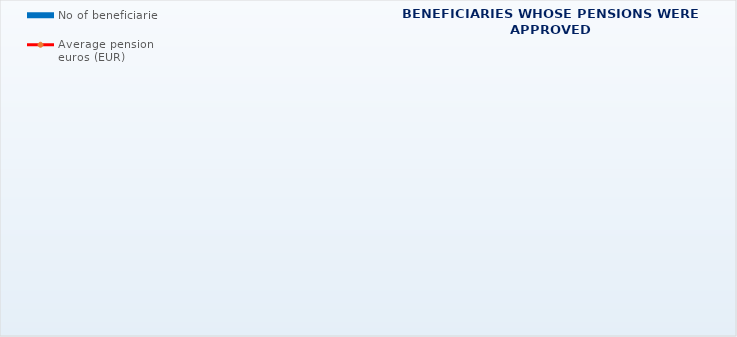
| Category | No of beneficiaries |
|---|---|
| Authorised officials in internal affairs, judicial officers and workers engaged in demining work: | 17264 |
| Pension beneficiaries entitled under the Fire Services Act (Official Gazette 125/19) | 333 |
| Active military personnel - DVO  | 16054 |
| Croatian Homeland Army veterans mobilised from 1941 to 1945 | 2047 |
| Former political prisoners | 2147 |
| Croatian Veterans from the Homeland War - ZOHBDR (Act on Croatian Homeland War Veterans and Their Family Members) | 71373 |
| Pensions approved under general regulations and determined according to the Act on the Rights of Croatian Homeland War Veterans and their Family Members (ZOHBDR), in 2017 (Art. 27, 35, 48 and 49, paragraph 2)    | 57155 |
| Former Yugoslav People's Army members - JNA   | 3826 |
| Former Yugoslav People's Army members - JNA - Art. 185 of Pension Insurance Act (ZOMO)  | 159 |
| National Liberation War veterans - NOR | 5271 |
| Members of the Croatian Parliament, members of the Government, judges of the Constitutional Court and the Auditor General | 682 |
| Members of the Parliamentary Executive Council and administratively retired federal civil servants  (relates to the former SFRY) | 68 |
| Former officials of federal bodies o the former SFRJ -  Article 38 of the Pension Insurance Act (ZOMO) | 19 |
| Full members of the Croatian Academy of Sciences and Arts - HAZU | 129 |
| Miners from the Istrian coal mines "Tupljak" d.d. Labin  | 248 |
| Workers professionally exposed to asbestos | 824 |
| Insurees - crew members on a ship in international and national navigation  - Article  129, paragraph 2 of the Maritime Code | 203 |
| Members of the Croatian Defence Council - HVO  | 6729 |